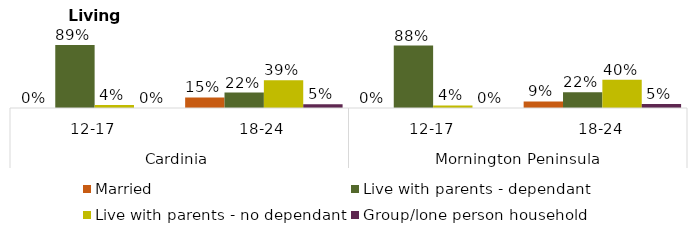
| Category | Married | Live with parents - dependant | Live with parents - no dependant | Group/lone person household |
|---|---|---|---|---|
| 0 | 0.002 | 0.886 | 0.044 | 0.002 |
| 1 | 0.148 | 0.218 | 0.39 | 0.053 |
| 2 | 0.001 | 0.88 | 0.036 | 0.001 |
| 3 | 0.092 | 0.224 | 0.397 | 0.055 |